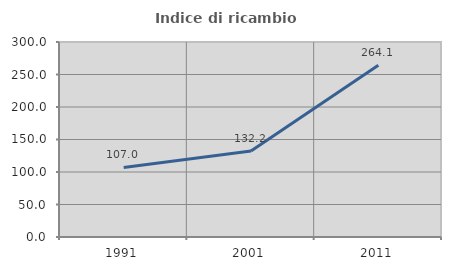
| Category | Indice di ricambio occupazionale  |
|---|---|
| 1991.0 | 106.971 |
| 2001.0 | 132.155 |
| 2011.0 | 264.141 |